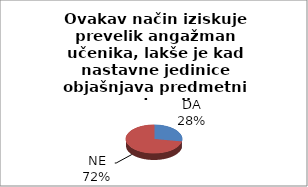
| Category | Series 0 |
|---|---|
| DA | 5 |
| NE | 13 |